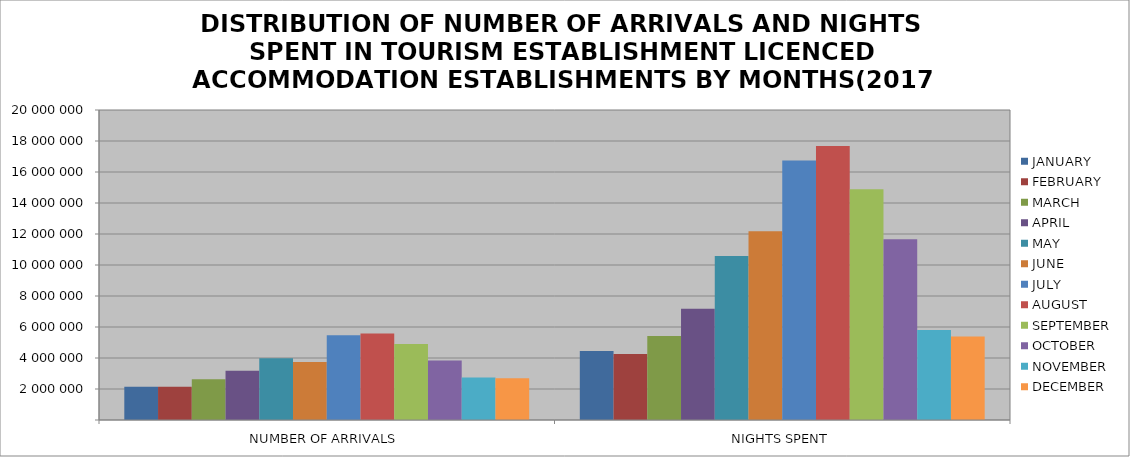
| Category | JANUARY | FEBRUARY | MARCH | APRIL | MAY | JUNE | JULY | AUGUST | SEPTEMBER | OCTOBER | NOVEMBER | DECEMBER |
|---|---|---|---|---|---|---|---|---|---|---|---|---|
| NUMBER OF ARRIVALS | 2146994 | 2141043 | 2629734 | 3173381 | 3978651 | 3742131 | 5470767 | 5580002 | 4908503 | 3834888 | 2748194 | 2693293 |
| NIGHTS SPENT | 4457352 | 4260377 | 5413903 | 7176325 | 10579158 | 12172370 | 16748728 | 17679357 | 14883465 | 11666779 | 5808320 | 5381562 |